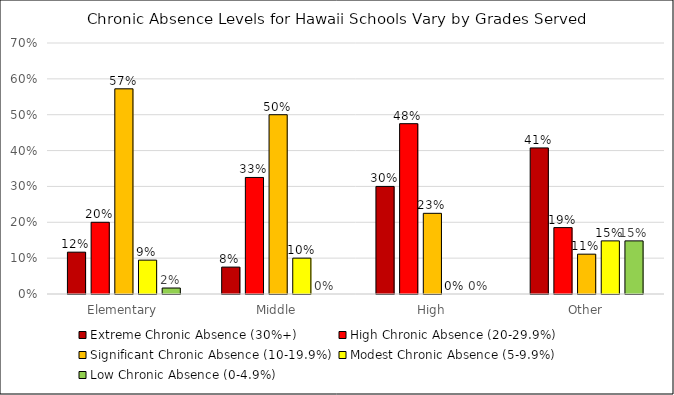
| Category | Extreme Chronic Absence (30%+) | High Chronic Absence (20-29.9%) | Significant Chronic Absence (10-19.9%) | Modest Chronic Absence (5-9.9%) | Low Chronic Absence (0-4.9%) |
|---|---|---|---|---|---|
| Elementary | 0.117 | 0.2 | 0.572 | 0.094 | 0.017 |
| Middle | 0.075 | 0.325 | 0.5 | 0.1 | 0 |
| High | 0.3 | 0.475 | 0.225 | 0 | 0 |
| Other | 0.407 | 0.185 | 0.111 | 0.148 | 0.148 |